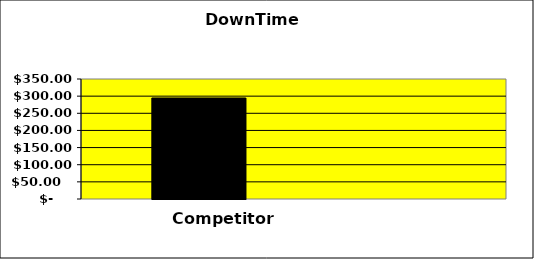
| Category | Series 0 | Series 1 | Series 2 |
|---|---|---|---|
| 0 | 294.667 |  | 0 |